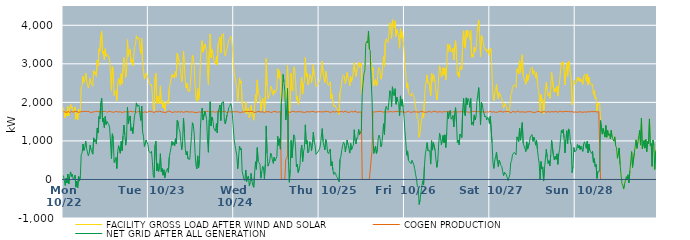
| Category | FACILITY GROSS LOAD AFTER WIND AND SOLAR | COGEN PRODUCTION | NET GRID AFTER ALL GENERATION |
|---|---|---|---|
|  Mon  10/22 | 1866 | 1765 | 101 |
|  Mon  10/22 | 1723 | 1753 | -30 |
|  Mon  10/22 | 1593 | 1747 | -154 |
|  Mon  10/22 | 1773 | 1740 | 33 |
|  Mon  10/22 | 1650 | 1743 | -93 |
|  Mon  10/22 | 1890 | 1751 | 139 |
|  Mon  10/22 | 1648 | 1763 | -115 |
|  Mon  10/22 | 1812 | 1734 | 78 |
|  Mon  10/22 | 1951 | 1754 | 197 |
|  Mon  10/22 | 1840 | 1764 | 76 |
|  Mon  10/22 | 1882 | 1746 | 136 |
|  Mon  10/22 | 1742 | 1747 | -5 |
|  Mon  10/22 | 1781 | 1750 | 31 |
|  Mon  10/22 | 1878 | 1766 | 112 |
|  Mon  10/22 | 1563 | 1762 | -199 |
|  Mon  10/22 | 1716 | 1764 | -48 |
|  Mon  10/22 | 1541 | 1758 | -217 |
|  Mon  10/22 | 1818 | 1738 | 80 |
|  Mon  10/22 | 1712 | 1754 | -42 |
|  Mon  10/22 | 1837 | 1758 | 79 |
|  Mon  10/22 | 2401 | 1761 | 640 |
|  Mon  10/22 | 2444 | 1755 | 689 |
|  Mon  10/22 | 2677 | 1759 | 918 |
|  Mon  10/22 | 2519 | 1766 | 753 |
|  Mon  10/22 | 2591 | 1764 | 827 |
|  Mon  10/22 | 2758 | 1765 | 993 |
|  Mon  10/22 | 2557 | 1749 | 808 |
|  Mon  10/22 | 2572 | 1761 | 811 |
|  Mon  10/22 | 2372 | 1761 | 611 |
|  Mon  10/22 | 2452 | 1766 | 686 |
|  Mon  10/22 | 2626 | 1736 | 890 |
|  Mon  10/22 | 2510 | 1736 | 774 |
|  Mon  10/22 | 2518 | 1745 | 773 |
|  Mon  10/22 | 2419 | 1763 | 656 |
|  Mon  10/22 | 2830 | 1751 | 1079 |
|  Mon  10/22 | 2729 | 1753 | 976 |
|  Mon  10/22 | 2796 | 1764 | 1032 |
|  Mon  10/22 | 2677 | 1759 | 918 |
|  Mon  10/22 | 3097 | 1766 | 1331 |
|  Mon  10/22 | 2948 | 1741 | 1207 |
|  Mon  10/22 | 3388 | 1757 | 1631 |
|  Mon  10/22 | 3323 | 1752 | 1571 |
|  Mon  10/22 | 3727 | 1745 | 1982 |
|  Mon  10/22 | 3847 | 1743 | 2104 |
|  Mon  10/22 | 3256 | 1758 | 1498 |
|  Mon  10/22 | 3327 | 1745 | 1582 |
|  Mon  10/22 | 3111 | 1765 | 1346 |
|  Mon  10/22 | 3391 | 1757 | 1634 |
|  Mon  10/22 | 3191 | 1765 | 1426 |
|  Mon  10/22 | 3239 | 1739 | 1500 |
|  Mon  10/22 | 3260 | 1750 | 1510 |
|  Mon  10/22 | 3191 | 1765 | 1426 |
|  Mon  10/22 | 3102 | 1767 | 1335 |
|  Mon  10/22 | 3093 | 1758 | 1335 |
|  Mon  10/22 | 2306 | 1766 | 540 |
|  Mon  10/22 | 2935 | 1750 | 1185 |
|  Mon  10/22 | 2825 | 1754 | 1071 |
|  Mon  10/22 | 2179 | 1739 | 440 |
|  Mon  10/22 | 2272 | 1765 | 507 |
|  Mon  10/22 | 2308 | 1740 | 568 |
|  Mon  10/22 | 2042 | 1757 | 285 |
|  Mon  10/22 | 2470 | 1753 | 717 |
|  Mon  10/22 | 2627 | 1751 | 876 |
|  Mon  10/22 | 2637 | 1739 | 898 |
|  Mon  10/22 | 2436 | 1755 | 681 |
|  Mon  10/22 | 2746 | 1757 | 989 |
|  Mon  10/22 | 2479 | 1737 | 742 |
|  Mon  10/22 | 2884 | 1757 | 1127 |
|  Mon  10/22 | 3165 | 1753 | 1412 |
|  Mon  10/22 | 2918 | 1753 | 1165 |
|  Mon  10/22 | 2645 | 1756 | 889 |
|  Mon  10/22 | 2870 | 1754 | 1116 |
|  Mon  10/22 | 3629 | 1753 | 1876 |
|  Mon  10/22 | 3179 | 1738 | 1441 |
|  Mon  10/22 | 3336 | 1752 | 1584 |
|  Mon  10/22 | 3385 | 1736 | 1649 |
|  Mon  10/22 | 3037 | 1771 | 1266 |
|  Mon  10/22 | 3108 | 1765 | 1343 |
|  Mon  10/22 | 2944 | 1751 | 1193 |
|  Mon  10/22 | 3189 | 1758 | 1431 |
|  Mon  10/22 | 3425 | 1765 | 1660 |
|  Mon  10/22 | 3503 | 1759 | 1744 |
|  Mon  10/22 | 3729 | 1742 | 1987 |
|  Mon  10/22 | 3651 | 1751 | 1900 |
|  Mon  10/22 | 3651 | 1762 | 1889 |
|  Mon  10/22 | 3674 | 1751 | 1923 |
|  Mon  10/22 | 3438 | 1754 | 1684 |
|  Mon  10/22 | 3273 | 1742 | 1531 |
|  Mon  10/22 | 3652 | 1749 | 1903 |
|  Mon  10/22 | 2980 | 1752 | 1228 |
|  Mon  10/22 | 2866 | 1742 | 1124 |
|  Mon  10/22 | 2604 | 1749 | 855 |
|  Mon  10/22 | 2612 | 1757 | 855 |
|  Mon  10/22 | 2757 | 1737 | 1020 |
|  Mon  10/22 | 2776 | 1737 | 1039 |
|  Mon  10/22 | 2658 | 1756 | 902 |
|  Tue  10/23 | 2504 | 1774 | 730 |
|  Tue  10/23 | 2503 | 1758 | 745 |
|  Tue  10/23 | 2446 | 1760 | 686 |
|  Tue  10/23 | 2477 | 1748 | 729 |
|  Tue  10/23 | 2228 | 1757 | 471 |
|  Tue  10/23 | 1856 | 1753 | 103 |
|  Tue  10/23 | 1785 | 1735 | 50 |
|  Tue  10/23 | 2648 | 1759 | 889 |
|  Tue  10/23 | 2758 | 1766 | 992 |
|  Tue  10/23 | 1977 | 1757 | 220 |
|  Tue  10/23 | 2165 | 1751 | 414 |
|  Tue  10/23 | 1965 | 1759 | 206 |
|  Tue  10/23 | 2108 | 1775 | 333 |
|  Tue  10/23 | 2430 | 1761 | 669 |
|  Tue  10/23 | 1958 | 1755 | 203 |
|  Tue  10/23 | 2056 | 1766 | 290 |
|  Tue  10/23 | 1856 | 1746 | 110 |
|  Tue  10/23 | 1992 | 1741 | 251 |
|  Tue  10/23 | 1782 | 1738 | 44 |
|  Tue  10/23 | 1936 | 1756 | 180 |
|  Tue  10/23 | 1924 | 1744 | 180 |
|  Tue  10/23 | 2049 | 1761 | 288 |
|  Tue  10/23 | 1955 | 1773 | 182 |
|  Tue  10/23 | 2348 | 1773 | 575 |
|  Tue  10/23 | 2470 | 1768 | 702 |
|  Tue  10/23 | 2598 | 1768 | 830 |
|  Tue  10/23 | 2725 | 1739 | 986 |
|  Tue  10/23 | 2648 | 1760 | 888 |
|  Tue  10/23 | 2708 | 1746 | 962 |
|  Tue  10/23 | 2629 | 1761 | 868 |
|  Tue  10/23 | 2814 | 1758 | 1056 |
|  Tue  10/23 | 2674 | 1749 | 925 |
|  Tue  10/23 | 3282 | 1744 | 1538 |
|  Tue  10/23 | 3266 | 1760 | 1506 |
|  Tue  10/23 | 3075 | 1766 | 1309 |
|  Tue  10/23 | 2971 | 1738 | 1233 |
|  Tue  10/23 | 2744 | 1755 | 989 |
|  Tue  10/23 | 2537 | 1764 | 773 |
|  Tue  10/23 | 2744 | 1763 | 981 |
|  Tue  10/23 | 3333 | 1739 | 1594 |
|  Tue  10/23 | 2954 | 1760 | 1194 |
|  Tue  10/23 | 2560 | 1755 | 805 |
|  Tue  10/23 | 2372 | 1738 | 634 |
|  Tue  10/23 | 2489 | 1762 | 727 |
|  Tue  10/23 | 2297 | 1760 | 537 |
|  Tue  10/23 | 2284 | 1748 | 536 |
|  Tue  10/23 | 2281 | 1759 | 522 |
|  Tue  10/23 | 2265 | 1753 | 512 |
|  Tue  10/23 | 2863 | 1750 | 1113 |
|  Tue  10/23 | 3222 | 1751 | 1471 |
|  Tue  10/23 | 3161 | 1757 | 1404 |
|  Tue  10/23 | 2948 | 1745 | 1203 |
|  Tue  10/23 | 2456 | 1757 | 699 |
|  Tue  10/23 | 2100 | 1732 | 368 |
|  Tue  10/23 | 2023 | 1750 | 273 |
|  Tue  10/23 | 2355 | 1743 | 612 |
|  Tue  10/23 | 2063 | 1755 | 308 |
|  Tue  10/23 | 2267 | 1752 | 515 |
|  Tue  10/23 | 3074 | 1761 | 1313 |
|  Tue  10/23 | 3452 | 1742 | 1710 |
|  Tue  10/23 | 3598 | 1745 | 1853 |
|  Tue  10/23 | 3299 | 1758 | 1541 |
|  Tue  10/23 | 3296 | 1742 | 1554 |
|  Tue  10/23 | 3515 | 1752 | 1763 |
|  Tue  10/23 | 3418 | 1735 | 1683 |
|  Tue  10/23 | 3324 | 1769 | 1555 |
|  Tue  10/23 | 2767 | 1746 | 1021 |
|  Tue  10/23 | 2462 | 1758 | 704 |
|  Tue  10/23 | 3339 | 1778 | 1561 |
|  Tue  10/23 | 3776 | 1759 | 2017 |
|  Tue  10/23 | 3154 | 1767 | 1387 |
|  Tue  10/23 | 3373 | 1753 | 1620 |
|  Tue  10/23 | 3296 | 1755 | 1541 |
|  Tue  10/23 | 3089 | 1755 | 1334 |
|  Tue  10/23 | 3038 | 1754 | 1284 |
|  Tue  10/23 | 2997 | 1745 | 1252 |
|  Tue  10/23 | 3202 | 1752 | 1450 |
|  Tue  10/23 | 2967 | 1759 | 1208 |
|  Tue  10/23 | 3515 | 1755 | 1760 |
|  Tue  10/23 | 3597 | 1765 | 1832 |
|  Tue  10/23 | 3692 | 1762 | 1930 |
|  Tue  10/23 | 3282 | 1753 | 1529 |
|  Tue  10/23 | 3751 | 1764 | 1987 |
|  Tue  10/23 | 3739 | 1758 | 1981 |
|  Tue  10/23 | 3775 | 1758 | 2017 |
|  Tue  10/23 | 3275 | 1767 | 1508 |
|  Tue  10/23 | 3206 | 1766 | 1440 |
|  Tue  10/23 | 3182 | 1751 | 1431 |
|  Tue  10/23 | 3399 | 1725 | 1674 |
|  Tue  10/23 | 3515 | 1755 | 1760 |
|  Tue  10/23 | 3622 | 1759 | 1863 |
|  Tue  10/23 | 3651 | 1756 | 1895 |
|  Tue  10/23 | 3719 | 1751 | 1968 |
|  Tue  10/23 | 3659 | 1747 | 1912 |
|  Tue  10/23 | 3434 | 1765 | 1669 |
|  Tue  10/23 | 3449 | 1760 | 1689 |
|  Wed  10/24 | 2783 | 1760 | 1023 |
|  Wed  10/24 | 2631 | 1753 | 878 |
|  Wed  10/24 | 2609 | 1742 | 867 |
|  Wed  10/24 | 2372 | 1758 | 614 |
|  Wed  10/24 | 2027 | 1750 | 277 |
|  Wed  10/24 | 2335 | 1750 | 585 |
|  Wed  10/24 | 2635 | 1769 | 866 |
|  Wed  10/24 | 2500 | 1735 | 765 |
|  Wed  10/24 | 2546 | 1742 | 804 |
|  Wed  10/24 | 1959 | 1754 | 205 |
|  Wed  10/24 | 1974 | 1759 | 215 |
|  Wed  10/24 | 1755 | 1748 | 7 |
|  Wed  10/24 | 1728 | 1762 | -34 |
|  Wed  10/24 | 2012 | 1766 | 246 |
|  Wed  10/24 | 1695 | 1749 | -54 |
|  Wed  10/24 | 1816 | 1766 | 50 |
|  Wed  10/24 | 1859 | 1768 | 91 |
|  Wed  10/24 | 1593 | 1761 | -168 |
|  Wed  10/24 | 1659 | 1739 | -80 |
|  Wed  10/24 | 1922 | 1765 | 157 |
|  Wed  10/24 | 1724 | 1767 | -43 |
|  Wed  10/24 | 1616 | 1769 | -153 |
|  Wed  10/24 | 1536 | 1740 | -204 |
|  Wed  10/24 | 1927 | 1752 | 175 |
|  Wed  10/24 | 2202 | 1741 | 461 |
|  Wed  10/24 | 1994 | 1731 | 263 |
|  Wed  10/24 | 2584 | 1758 | 826 |
|  Wed  10/24 | 2211 | 1742 | 469 |
|  Wed  10/24 | 2203 | 1766 | 437 |
|  Wed  10/24 | 2152 | 1758 | 394 |
|  Wed  10/24 | 1779 | 1746 | 33 |
|  Wed  10/24 | 1943 | 1755 | 188 |
|  Wed  10/24 | 2104 | 1758 | 346 |
|  Wed  10/24 | 2056 | 1758 | 298 |
|  Wed  10/24 | 1746 | 1729 | 17 |
|  Wed  10/24 | 2154 | 1757 | 397 |
|  Wed  10/24 | 3144 | 1755 | 1389 |
|  Wed  10/24 | 2429 | 1756 | 673 |
|  Wed  10/24 | 2092 | 1746 | 346 |
|  Wed  10/24 | 2164 | 1759 | 405 |
|  Wed  10/24 | 2222 | 1747 | 475 |
|  Wed  10/24 | 2424 | 1741 | 683 |
|  Wed  10/24 | 2385 | 1760 | 625 |
|  Wed  10/24 | 2249 | 1740 | 509 |
|  Wed  10/24 | 2187 | 1771 | 416 |
|  Wed  10/24 | 2326 | 1752 | 574 |
|  Wed  10/24 | 2240 | 1759 | 481 |
|  Wed  10/24 | 2222 | 1741 | 481 |
|  Wed  10/24 | 2345 | 1749 | 596 |
|  Wed  10/24 | 2875 | 1755 | 1120 |
|  Wed  10/24 | 2630 | 1747 | 883 |
|  Wed  10/24 | 2824 | 1768 | 1056 |
|  Wed  10/24 | 2548 | 1763 | 785 |
|  Wed  10/24 | 1974 | 0 | 1974 |
|  Wed  10/24 | 2272 | 0 | 2272 |
|  Wed  10/24 | 2725 | 0 | 2725 |
|  Wed  10/24 | 2524 | 0 | 2524 |
|  Wed  10/24 | 2282 | 0 | 2282 |
|  Wed  10/24 | 2053 | 511 | 1542 |
|  Wed  10/24 | 2307 | 509 | 1798 |
|  Wed  10/24 | 2971 | 608 | 2363 |
|  Wed  10/24 | 2261 | 1767 | 494 |
|  Wed  10/24 | 1695 | 1769 | -74 |
|  Wed  10/24 | 1997 | 1732 | 265 |
|  Wed  10/24 | 2762 | 1748 | 1014 |
|  Wed  10/24 | 2331 | 1771 | 560 |
|  Wed  10/24 | 2294 | 1752 | 542 |
|  Wed  10/24 | 2921 | 1764 | 1157 |
|  Wed  10/24 | 2873 | 1760 | 1113 |
|  Wed  10/24 | 2586 | 1751 | 835 |
|  Wed  10/24 | 2070 | 1743 | 327 |
|  Wed  10/24 | 2154 | 1756 | 398 |
|  Wed  10/24 | 1945 | 1765 | 180 |
|  Wed  10/24 | 2017 | 1759 | 258 |
|  Wed  10/24 | 2127 | 1751 | 376 |
|  Wed  10/24 | 2522 | 1754 | 768 |
|  Wed  10/24 | 2649 | 1758 | 891 |
|  Wed  10/24 | 2215 | 1749 | 466 |
|  Wed  10/24 | 2472 | 1747 | 725 |
|  Wed  10/24 | 2558 | 1737 | 821 |
|  Wed  10/24 | 3162 | 1744 | 1418 |
|  Wed  10/24 | 2672 | 1753 | 919 |
|  Wed  10/24 | 2751 | 1744 | 1007 |
|  Wed  10/24 | 2451 | 1759 | 692 |
|  Wed  10/24 | 2490 | 1768 | 722 |
|  Wed  10/24 | 2731 | 1749 | 982 |
|  Wed  10/24 | 2699 | 1754 | 945 |
|  Wed  10/24 | 2508 | 1761 | 747 |
|  Wed  10/24 | 2703 | 1749 | 954 |
|  Wed  10/24 | 2992 | 1764 | 1228 |
|  Wed  10/24 | 2709 | 1746 | 963 |
|  Wed  10/24 | 2630 | 1745 | 885 |
|  Wed  10/24 | 2404 | 1753 | 651 |
|  Wed  10/24 | 2419 | 1750 | 669 |
|  Wed  10/24 | 2461 | 1751 | 710 |
|  Wed  10/24 | 2465 | 1759 | 706 |
|  Thu  10/25 | 2544 | 1756 | 788 |
|  Thu  10/25 | 2649 | 1754 | 895 |
|  Thu  10/25 | 2649 | 1768 | 881 |
|  Thu  10/25 | 3074 | 1755 | 1319 |
|  Thu  10/25 | 2739 | 1760 | 979 |
|  Thu  10/25 | 2612 | 1751 | 861 |
|  Thu  10/25 | 2515 | 1747 | 768 |
|  Thu  10/25 | 2804 | 1770 | 1034 |
|  Thu  10/25 | 2704 | 1756 | 948 |
|  Thu  10/25 | 2475 | 1761 | 714 |
|  Thu  10/25 | 2436 | 1767 | 669 |
|  Thu  10/25 | 2475 | 1751 | 724 |
|  Thu  10/25 | 2532 | 1746 | 786 |
|  Thu  10/25 | 2094 | 1739 | 355 |
|  Thu  10/25 | 2216 | 1755 | 461 |
|  Thu  10/25 | 2017 | 1766 | 251 |
|  Thu  10/25 | 1890 | 1762 | 128 |
|  Thu  10/25 | 1935 | 1746 | 189 |
|  Thu  10/25 | 1917 | 1756 | 161 |
|  Thu  10/25 | 1846 | 1765 | 81 |
|  Thu  10/25 | 1808 | 1758 | 50 |
|  Thu  10/25 | 1795 | 1747 | 48 |
|  Thu  10/25 | 1687 | 1749 | -62 |
|  Thu  10/25 | 2279 | 1757 | 522 |
|  Thu  10/25 | 2353 | 1753 | 600 |
|  Thu  10/25 | 2524 | 1765 | 759 |
|  Thu  10/25 | 2652 | 1767 | 885 |
|  Thu  10/25 | 2717 | 1748 | 969 |
|  Thu  10/25 | 2668 | 1742 | 926 |
|  Thu  10/25 | 2489 | 1777 | 712 |
|  Thu  10/25 | 2616 | 1749 | 867 |
|  Thu  10/25 | 2777 | 1755 | 1022 |
|  Thu  10/25 | 2647 | 1746 | 901 |
|  Thu  10/25 | 2577 | 1765 | 812 |
|  Thu  10/25 | 2427 | 1743 | 684 |
|  Thu  10/25 | 2671 | 1737 | 934 |
|  Thu  10/25 | 2542 | 1769 | 773 |
|  Thu  10/25 | 2605 | 1755 | 850 |
|  Thu  10/25 | 2626 | 1747 | 879 |
|  Thu  10/25 | 3030 | 1741 | 1289 |
|  Thu  10/25 | 2778 | 1777 | 1001 |
|  Thu  10/25 | 2670 | 1750 | 920 |
|  Thu  10/25 | 2834 | 1757 | 1077 |
|  Thu  10/25 | 2852 | 1742 | 1110 |
|  Thu  10/25 | 3044 | 1748 | 1296 |
|  Thu  10/25 | 2908 | 1748 | 1160 |
|  Thu  10/25 | 2915 | 1760 | 1155 |
|  Thu  10/25 | 3022 | 1751 | 1271 |
|  Thu  10/25 | 2215 | 0 | 2215 |
|  Thu  10/25 | 2526 | 0 | 2526 |
|  Thu  10/25 | 2752 | 0 | 2752 |
|  Thu  10/25 | 2828 | 0 | 2828 |
|  Thu  10/25 | 3523 | 0 | 3523 |
|  Thu  10/25 | 3577 | 0 | 3577 |
|  Thu  10/25 | 3541 | 0 | 3541 |
|  Thu  10/25 | 3849 | 0 | 3849 |
|  Thu  10/25 | 3382 | 0 | 3382 |
|  Thu  10/25 | 3344 | 0 | 3344 |
|  Thu  10/25 | 3094 | 508 | 2586 |
|  Thu  10/25 | 2841 | 730 | 2111 |
|  Thu  10/25 | 2902 | 1756 | 1146 |
|  Thu  10/25 | 2426 | 1751 | 675 |
|  Thu  10/25 | 2424 | 1750 | 674 |
|  Thu  10/25 | 2599 | 1733 | 866 |
|  Thu  10/25 | 2427 | 1758 | 669 |
|  Thu  10/25 | 2533 | 1761 | 772 |
|  Thu  10/25 | 2832 | 1761 | 1071 |
|  Thu  10/25 | 2908 | 1757 | 1151 |
|  Thu  10/25 | 2829 | 1768 | 1061 |
|  Thu  10/25 | 2602 | 1754 | 848 |
|  Thu  10/25 | 2674 | 1759 | 915 |
|  Thu  10/25 | 2924 | 1762 | 1162 |
|  Thu  10/25 | 3190 | 1744 | 1446 |
|  Thu  10/25 | 2936 | 1769 | 1167 |
|  Thu  10/25 | 3572 | 1757 | 1815 |
|  Thu  10/25 | 3656 | 1760 | 1896 |
|  Thu  10/25 | 3573 | 1750 | 1823 |
|  Thu  10/25 | 3542 | 1747 | 1795 |
|  Thu  10/25 | 3768 | 1754 | 2014 |
|  Thu  10/25 | 4062 | 1761 | 2301 |
|  Thu  10/25 | 4005 | 1765 | 2240 |
|  Thu  10/25 | 3645 | 1757 | 1888 |
|  Thu  10/25 | 4153 | 1750 | 2403 |
|  Thu  10/25 | 3970 | 1760 | 2210 |
|  Thu  10/25 | 3928 | 1759 | 2169 |
|  Thu  10/25 | 4117 | 1762 | 2355 |
|  Thu  10/25 | 3710 | 1760 | 1950 |
|  Thu  10/25 | 3893 | 1758 | 2135 |
|  Thu  10/25 | 3786 | 1762 | 2024 |
|  Thu  10/25 | 3750 | 1773 | 1977 |
|  Thu  10/25 | 3404 | 1756 | 1648 |
|  Thu  10/25 | 3926 | 1758 | 2168 |
|  Thu  10/25 | 3671 | 1757 | 1914 |
|  Thu  10/25 | 3835 | 1761 | 2074 |
|  Thu  10/25 | 3627 | 1752 | 1875 |
|  Thu  10/25 | 3380 | 1764 | 1616 |
|  Fri  10/26 | 3008 | 1740 | 1268 |
|  Fri  10/26 | 2740 | 1759 | 981 |
|  Fri  10/26 | 2380 | 1752 | 628 |
|  Fri  10/26 | 2491 | 1750 | 741 |
|  Fri  10/26 | 2269 | 1769 | 500 |
|  Fri  10/26 | 2212 | 1752 | 460 |
|  Fri  10/26 | 2186 | 1743 | 443 |
|  Fri  10/26 | 2158 | 1749 | 409 |
|  Fri  10/26 | 2244 | 1745 | 499 |
|  Fri  10/26 | 2216 | 1742 | 474 |
|  Fri  10/26 | 2143 | 1760 | 383 |
|  Fri  10/26 | 2043 | 1763 | 280 |
|  Fri  10/26 | 1885 | 1751 | 134 |
|  Fri  10/26 | 1766 | 1750 | 16 |
|  Fri  10/26 | 1575 | 1752 | -177 |
|  Fri  10/26 | 1549 | 1755 | -206 |
|  Fri  10/26 | 1095 | 1743 | -648 |
|  Fri  10/26 | 1218 | 1756 | -538 |
|  Fri  10/26 | 1427 | 1768 | -341 |
|  Fri  10/26 | 1440 | 1759 | -319 |
|  Fri  10/26 | 1722 | 1758 | -36 |
|  Fri  10/26 | 1605 | 1742 | -137 |
|  Fri  10/26 | 2098 | 1745 | 353 |
|  Fri  10/26 | 2427 | 1762 | 665 |
|  Fri  10/26 | 2539 | 1742 | 797 |
|  Fri  10/26 | 2713 | 1757 | 956 |
|  Fri  10/26 | 2498 | 1755 | 743 |
|  Fri  10/26 | 2525 | 1759 | 766 |
|  Fri  10/26 | 2510 | 1763 | 747 |
|  Fri  10/26 | 2167 | 1769 | 398 |
|  Fri  10/26 | 2747 | 1741 | 1006 |
|  Fri  10/26 | 2527 | 1766 | 761 |
|  Fri  10/26 | 2724 | 1766 | 958 |
|  Fri  10/26 | 2723 | 1752 | 971 |
|  Fri  10/26 | 2521 | 1768 | 753 |
|  Fri  10/26 | 2253 | 1761 | 492 |
|  Fri  10/26 | 2060 | 1746 | 314 |
|  Fri  10/26 | 2247 | 1748 | 499 |
|  Fri  10/26 | 2673 | 1754 | 919 |
|  Fri  10/26 | 2950 | 1756 | 1194 |
|  Fri  10/26 | 2842 | 1756 | 1086 |
|  Fri  10/26 | 2654 | 1757 | 897 |
|  Fri  10/26 | 2636 | 1747 | 889 |
|  Fri  10/26 | 2898 | 1756 | 1142 |
|  Fri  10/26 | 2703 | 1757 | 946 |
|  Fri  10/26 | 2894 | 1737 | 1157 |
|  Fri  10/26 | 2589 | 1758 | 831 |
|  Fri  10/26 | 2964 | 1764 | 1200 |
|  Fri  10/26 | 3510 | 1754 | 1756 |
|  Fri  10/26 | 3313 | 1744 | 1569 |
|  Fri  10/26 | 3512 | 1765 | 1747 |
|  Fri  10/26 | 3536 | 1745 | 1791 |
|  Fri  10/26 | 3308 | 1746 | 1562 |
|  Fri  10/26 | 3352 | 1752 | 1600 |
|  Fri  10/26 | 3409 | 1749 | 1660 |
|  Fri  10/26 | 3103 | 1738 | 1365 |
|  Fri  10/26 | 3471 | 1764 | 1707 |
|  Fri  10/26 | 3605 | 1742 | 1863 |
|  Fri  10/26 | 3241 | 1749 | 1492 |
|  Fri  10/26 | 2707 | 1749 | 958 |
|  Fri  10/26 | 2774 | 1754 | 1020 |
|  Fri  10/26 | 2652 | 1757 | 895 |
|  Fri  10/26 | 2932 | 1754 | 1178 |
|  Fri  10/26 | 2903 | 1758 | 1145 |
|  Fri  10/26 | 2850 | 1763 | 1087 |
|  Fri  10/26 | 3583 | 1762 | 1821 |
|  Fri  10/26 | 3856 | 1753 | 2103 |
|  Fri  10/26 | 3453 | 1746 | 1707 |
|  Fri  10/26 | 3405 | 1757 | 1648 |
|  Fri  10/26 | 3874 | 1756 | 2118 |
|  Fri  10/26 | 3693 | 1754 | 1939 |
|  Fri  10/26 | 3859 | 1762 | 2097 |
|  Fri  10/26 | 3783 | 1740 | 2043 |
|  Fri  10/26 | 3633 | 1764 | 1869 |
|  Fri  10/26 | 3859 | 1756 | 2103 |
|  Fri  10/26 | 3174 | 1750 | 1424 |
|  Fri  10/26 | 3256 | 1765 | 1491 |
|  Fri  10/26 | 3167 | 1761 | 1406 |
|  Fri  10/26 | 3438 | 1764 | 1674 |
|  Fri  10/26 | 3308 | 1765 | 1543 |
|  Fri  10/26 | 3396 | 1762 | 1634 |
|  Fri  10/26 | 3779 | 1755 | 2024 |
|  Fri  10/26 | 3766 | 1758 | 2008 |
|  Fri  10/26 | 4134 | 1752 | 2382 |
|  Fri  10/26 | 3736 | 1760 | 1976 |
|  Fri  10/26 | 3176 | 1759 | 1417 |
|  Fri  10/26 | 3740 | 1743 | 1997 |
|  Fri  10/26 | 3697 | 1757 | 1940 |
|  Fri  10/26 | 3561 | 1764 | 1797 |
|  Fri  10/26 | 3547 | 1745 | 1802 |
|  Fri  10/26 | 3364 | 1744 | 1620 |
|  Fri  10/26 | 3391 | 1743 | 1648 |
|  Fri  10/26 | 3297 | 1755 | 1542 |
|  Fri  10/26 | 3376 | 1764 | 1612 |
|  Fri  10/26 | 3330 | 1747 | 1583 |
|  Fri  10/26 | 3217 | 1765 | 1452 |
|  Sat  10/27 | 3411 | 1772 | 1639 |
|  Sat  10/27 | 3383 | 1761 | 1622 |
|  Sat  10/27 | 2699 | 1745 | 954 |
|  Sat  10/27 | 2197 | 1751 | 446 |
|  Sat  10/27 | 2043 | 1757 | 286 |
|  Sat  10/27 | 2248 | 1762 | 486 |
|  Sat  10/27 | 2334 | 1743 | 591 |
|  Sat  10/27 | 2464 | 1751 | 713 |
|  Sat  10/27 | 2218 | 1745 | 473 |
|  Sat  10/27 | 2085 | 1754 | 331 |
|  Sat  10/27 | 2257 | 1761 | 496 |
|  Sat  10/27 | 2208 | 1771 | 437 |
|  Sat  10/27 | 2137 | 1774 | 363 |
|  Sat  10/27 | 2098 | 1761 | 337 |
|  Sat  10/27 | 1941 | 1745 | 196 |
|  Sat  10/27 | 1855 | 1754 | 101 |
|  Sat  10/27 | 1944 | 1759 | 185 |
|  Sat  10/27 | 1975 | 1771 | 204 |
|  Sat  10/27 | 1891 | 1759 | 132 |
|  Sat  10/27 | 1797 | 1746 | 51 |
|  Sat  10/27 | 1739 | 1769 | -30 |
|  Sat  10/27 | 1759 | 1774 | -15 |
|  Sat  10/27 | 1869 | 1745 | 124 |
|  Sat  10/27 | 2194 | 1761 | 433 |
|  Sat  10/27 | 2226 | 1734 | 492 |
|  Sat  10/27 | 2411 | 1768 | 643 |
|  Sat  10/27 | 2405 | 1759 | 646 |
|  Sat  10/27 | 2453 | 1751 | 702 |
|  Sat  10/27 | 2465 | 1750 | 715 |
|  Sat  10/27 | 2388 | 1749 | 639 |
|  Sat  10/27 | 2874 | 1769 | 1105 |
|  Sat  10/27 | 2890 | 1777 | 1113 |
|  Sat  10/27 | 2736 | 1752 | 984 |
|  Sat  10/27 | 3079 | 1749 | 1330 |
|  Sat  10/27 | 2775 | 1757 | 1018 |
|  Sat  10/27 | 2778 | 1752 | 1026 |
|  Sat  10/27 | 3233 | 1758 | 1475 |
|  Sat  10/27 | 2696 | 1752 | 944 |
|  Sat  10/27 | 2620 | 1756 | 864 |
|  Sat  10/27 | 2543 | 1744 | 799 |
|  Sat  10/27 | 2469 | 1746 | 723 |
|  Sat  10/27 | 2728 | 1753 | 975 |
|  Sat  10/27 | 2550 | 1764 | 786 |
|  Sat  10/27 | 2525 | 1758 | 767 |
|  Sat  10/27 | 2721 | 1766 | 955 |
|  Sat  10/27 | 2860 | 1759 | 1101 |
|  Sat  10/27 | 2887 | 1751 | 1136 |
|  Sat  10/27 | 2917 | 1752 | 1165 |
|  Sat  10/27 | 2723 | 1736 | 987 |
|  Sat  10/27 | 2831 | 1735 | 1096 |
|  Sat  10/27 | 2778 | 1756 | 1022 |
|  Sat  10/27 | 2634 | 1744 | 890 |
|  Sat  10/27 | 2776 | 1756 | 1020 |
|  Sat  10/27 | 2547 | 1763 | 784 |
|  Sat  10/27 | 2332 | 1761 | 571 |
|  Sat  10/27 | 2187 | 1764 | 423 |
|  Sat  10/27 | 1745 | 1749 | -4 |
|  Sat  10/27 | 2205 | 1741 | 464 |
|  Sat  10/27 | 2032 | 1761 | 271 |
|  Sat  10/27 | 2079 | 1753 | 326 |
|  Sat  10/27 | 1706 | 1748 | -42 |
|  Sat  10/27 | 2053 | 1764 | 289 |
|  Sat  10/27 | 2297 | 1766 | 531 |
|  Sat  10/27 | 2523 | 1742 | 781 |
|  Sat  10/27 | 2337 | 1763 | 574 |
|  Sat  10/27 | 2178 | 1764 | 414 |
|  Sat  10/27 | 2237 | 1751 | 486 |
|  Sat  10/27 | 2099 | 1745 | 354 |
|  Sat  10/27 | 2395 | 1757 | 638 |
|  Sat  10/27 | 2774 | 1761 | 1013 |
|  Sat  10/27 | 2778 | 1756 | 1022 |
|  Sat  10/27 | 2373 | 1752 | 621 |
|  Sat  10/27 | 2263 | 1759 | 504 |
|  Sat  10/27 | 2362 | 1760 | 602 |
|  Sat  10/27 | 2279 | 1756 | 523 |
|  Sat  10/27 | 2421 | 1756 | 665 |
|  Sat  10/27 | 2162 | 1769 | 393 |
|  Sat  10/27 | 2414 | 1743 | 671 |
|  Sat  10/27 | 2550 | 1777 | 773 |
|  Sat  10/27 | 2816 | 1758 | 1058 |
|  Sat  10/27 | 3036 | 1759 | 1277 |
|  Sat  10/27 | 2972 | 1768 | 1204 |
|  Sat  10/27 | 3052 | 1753 | 1299 |
|  Sat  10/27 | 2846 | 1766 | 1080 |
|  Sat  10/27 | 2454 | 1767 | 687 |
|  Sat  10/27 | 2782 | 1750 | 1032 |
|  Sat  10/27 | 3028 | 1763 | 1265 |
|  Sat  10/27 | 2674 | 1747 | 927 |
|  Sat  10/27 | 3073 | 1761 | 1312 |
|  Sat  10/27 | 3047 | 1765 | 1282 |
|  Sat  10/27 | 2747 | 1755 | 992 |
|  Sat  10/27 | 2638 | 1758 | 880 |
|  Sat  10/27 | 1936 | 1760 | 176 |
|  Sat  10/27 | 2099 | 1761 | 338 |
|  Sat  10/27 | 2573 | 1745 | 828 |
|  Sat  10/27 | 2475 | 1761 | 714 |
|  Sun  10/28 | 2478 | 1751 | 727 |
|  Sun  10/28 | 2517 | 1754 | 763 |
|  Sun  10/28 | 2646 | 1742 | 904 |
|  Sun  10/28 | 2569 | 1753 | 816 |
|  Sun  10/28 | 2645 | 1757 | 888 |
|  Sun  10/28 | 2541 | 1763 | 778 |
|  Sun  10/28 | 2613 | 1751 | 862 |
|  Sun  10/28 | 2533 | 1746 | 787 |
|  Sun  10/28 | 2467 | 1740 | 727 |
|  Sun  10/28 | 2668 | 1751 | 917 |
|  Sun  10/28 | 2730 | 1754 | 976 |
|  Sun  10/28 | 2751 | 1765 | 986 |
|  Sun  10/28 | 2550 | 1745 | 805 |
|  Sun  10/28 | 2738 | 1753 | 985 |
|  Sun  10/28 | 2449 | 1758 | 691 |
|  Sun  10/28 | 2660 | 1742 | 918 |
|  Sun  10/28 | 2503 | 1754 | 749 |
|  Sun  10/28 | 2505 | 1758 | 747 |
|  Sun  10/28 | 2439 | 1764 | 675 |
|  Sun  10/28 | 2471 | 1741 | 730 |
|  Sun  10/28 | 2200 | 1757 | 443 |
|  Sun  10/28 | 2316 | 1774 | 542 |
|  Sun  10/28 | 2097 | 1762 | 335 |
|  Sun  10/28 | 2134 | 1746 | 388 |
|  Sun  10/28 | 1778 | 1749 | 29 |
|  Sun  10/28 | 1965 | 1759 | 206 |
|  Sun  10/28 | 1955 | 1757 | 198 |
|  Sun  10/28 | 1977 | 1757 | 220 |
|  Sun  10/28 | 1531 | 0 | 1531 |
|  Sun  10/28 | 1533 | 0 | 1533 |
|  Sun  10/28 | 1176 | 0 | 1176 |
|  Sun  10/28 | 1325 | 0 | 1325 |
|  Sun  10/28 | 1311 | 0 | 1311 |
|  Sun  10/28 | 1099 | 0 | 1099 |
|  Sun  10/28 | 1401 | 0 | 1401 |
|  Sun  10/28 | 1094 | 0 | 1094 |
|  Sun  10/28 | 1279 | 0 | 1279 |
|  Sun  10/28 | 1145 | 0 | 1145 |
|  Sun  10/28 | 1184 | 0 | 1184 |
|  Sun  10/28 | 1051 | 0 | 1051 |
|  Sun  10/28 | 1274 | 0 | 1274 |
|  Sun  10/28 | 1100 | 0 | 1100 |
|  Sun  10/28 | 1090 | 0 | 1090 |
|  Sun  10/28 | 995 | 0 | 995 |
|  Sun  10/28 | 1107 | 0 | 1107 |
|  Sun  10/28 | 875 | 0 | 875 |
|  Sun  10/28 | 821 | 0 | 821 |
|  Sun  10/28 | 548 | 0 | 548 |
|  Sun  10/28 | 562 | 0 | 562 |
|  Sun  10/28 | 818 | 0 | 818 |
|  Sun  10/28 | 383 | 0 | 383 |
|  Sun  10/28 | 140 | 0 | 140 |
|  Sun  10/28 | -95 | 0 | -95 |
|  Sun  10/28 | -159 | 0 | -159 |
|  Sun  10/28 | -249 | 0 | -249 |
|  Sun  10/28 | -116 | 0 | -116 |
|  Sun  10/28 | -101 | 0 | -101 |
|  Sun  10/28 | 73 | 0 | 73 |
|  Sun  10/28 | -16 | 0 | -16 |
|  Sun  10/28 | 122 | 0 | 122 |
|  Sun  10/28 | -89 | 0 | -89 |
|  Sun  10/28 | 229 | 0 | 229 |
|  Sun  10/28 | 239 | 0 | 239 |
|  Sun  10/28 | 723 | 0 | 723 |
|  Sun  10/28 | 311 | 0 | 311 |
|  Sun  10/28 | 324 | 0 | 324 |
|  Sun  10/28 | 686 | 0 | 686 |
|  Sun  10/28 | 692 | 0 | 692 |
|  Sun  10/28 | 1027 | 0 | 1027 |
|  Sun  10/28 | 806 | 0 | 806 |
|  Sun  10/28 | 966 | 0 | 966 |
|  Sun  10/28 | 941 | 0 | 941 |
|  Sun  10/28 | 1275 | 0 | 1275 |
|  Sun  10/28 | 891 | 0 | 891 |
|  Sun  10/28 | 1594 | 0 | 1594 |
|  Sun  10/28 | 793 | 0 | 793 |
|  Sun  10/28 | 768 | 0 | 768 |
|  Sun  10/28 | 1010 | 0 | 1010 |
|  Sun  10/28 | 811 | 0 | 811 |
|  Sun  10/28 | 1037 | 0 | 1037 |
|  Sun  10/28 | 721 | 0 | 721 |
|  Sun  10/28 | 981 | 0 | 981 |
|  Sun  10/28 | 926 | 0 | 926 |
|  Sun  10/28 | 1571 | 0 | 1571 |
|  Sun  10/28 | 872 | 0 | 872 |
|  Sun  10/28 | 930 | 0 | 930 |
|  Sun  10/28 | 339 | 0 | 339 |
|  Sun  10/28 | 1021 | 0 | 1021 |
|  Sun  10/28 | 893 | 0 | 893 |
|  Sun  10/28 | 258 | 0 | 258 |
|  Sun  10/28 | 727 | 0 | 727 |
|  Sun  10/28 | 787 | 0 | 787 |